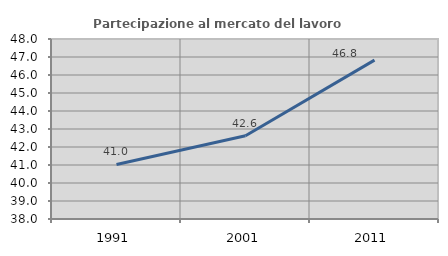
| Category | Partecipazione al mercato del lavoro  femminile |
|---|---|
| 1991.0 | 41.031 |
| 2001.0 | 42.627 |
| 2011.0 | 46.825 |